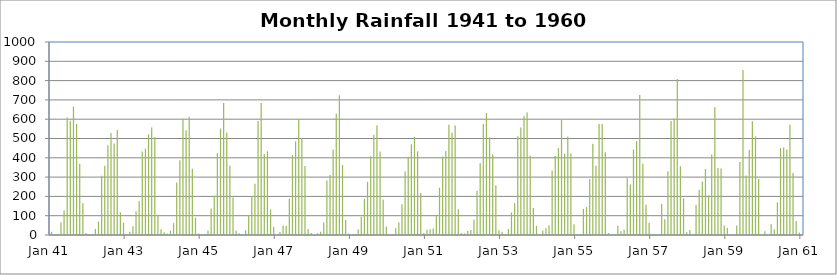
| Category | Monthly Rainfall |
|---|---|
| 1921-01-31 | 5.6 |
| 1921-02-28 | 4.6 |
| 1921-03-31 | 69.1 |
| 1921-04-30 | 92.2 |
| 1921-05-31 | 277.6 |
| 1921-06-30 | 375.2 |
| 1921-07-31 | 478.5 |
| 1921-08-31 | 572 |
| 1921-09-30 | 525.5 |
| 1921-10-31 | 407.7 |
| 1921-11-30 | 175.3 |
| 1921-12-31 | 46.2 |
| 1922-01-31 | 5.6 |
| 1922-02-28 | 4.6 |
| 1922-03-31 | 32 |
| 1922-04-30 | 75.9 |
| 1922-05-31 | 267 |
| 1922-06-30 | 479.8 |
| 1922-07-31 | 480.6 |
| 1922-08-31 | 583.7 |
| 1922-09-30 | 572.8 |
| 1922-10-31 | 399.8 |
| 1922-11-30 | 188.7 |
| 1922-12-31 | 37.6 |
| 1923-01-31 | 5.6 |
| 1923-02-28 | 4.6 |
| 1923-03-31 | 43.9 |
| 1923-04-30 | 93.7 |
| 1923-05-31 | 205.7 |
| 1923-06-30 | 435.1 |
| 1923-07-31 | 482.1 |
| 1923-08-31 | 575.8 |
| 1923-09-30 | 572.8 |
| 1923-10-31 | 411.7 |
| 1923-11-30 | 298.7 |
| 1923-12-31 | 33 |
| 1924-01-31 | 6.3 |
| 1924-02-29 | 49.5 |
| 1924-03-31 | 17.3 |
| 1924-04-30 | 62.2 |
| 1924-05-31 | 235.2 |
| 1924-06-30 | 422.9 |
| 1924-07-31 | 479 |
| 1924-08-31 | 588.3 |
| 1924-09-30 | 565.7 |
| 1924-10-31 | 405.1 |
| 1924-11-30 | 227.6 |
| 1924-12-31 | 18.8 |
| 1925-01-31 | 5.6 |
| 1925-02-28 | 16.8 |
| 1925-03-31 | 53.1 |
| 1925-04-30 | 53.3 |
| 1925-05-31 | 232.9 |
| 1925-06-30 | 435.9 |
| 1925-07-31 | 475.5 |
| 1925-08-31 | 572.8 |
| 1925-09-30 | 548.1 |
| 1925-10-31 | 435.9 |
| 1925-11-30 | 202.9 |
| 1925-12-31 | 28.7 |
| 1926-01-31 | 6.1 |
| 1926-02-28 | 4.6 |
| 1926-03-31 | 25.9 |
| 1926-04-30 | 55.9 |
| 1926-05-31 | 211.3 |
| 1926-06-30 | 398 |
| 1926-07-31 | 481.1 |
| 1926-08-31 | 598.9 |
| 1926-09-30 | 577.3 |
| 1926-10-31 | 400.6 |
| 1926-11-30 | 202.9 |
| 1926-12-31 | 22.4 |
| 1927-01-31 | 5.6 |
| 1927-02-28 | 6.3 |
| 1927-03-31 | 21.8 |
| 1927-04-30 | 89.7 |
| 1927-05-31 | 245.4 |
| 1927-06-30 | 426.5 |
| 1927-07-31 | 472.2 |
| 1927-08-31 | 559.6 |
| 1927-09-30 | 589.8 |
| 1927-10-31 | 445.3 |
| 1927-11-30 | 115.6 |
| 1927-12-31 | 22.4 |
| 1928-01-31 | 6.6 |
| 1928-02-29 | 4.6 |
| 1928-03-31 | 35.6 |
| 1928-04-30 | 145.5 |
| 1928-05-31 | 214.6 |
| 1928-06-30 | 379.7 |
| 1928-07-31 | 492.8 |
| 1928-08-31 | 586.2 |
| 1928-09-30 | 557.3 |
| 1928-10-31 | 448.6 |
| 1928-11-30 | 135.4 |
| 1928-12-31 | 24.9 |
| 1929-01-31 | 5.6 |
| 1929-02-28 | 4.6 |
| 1929-03-31 | 58.4 |
| 1929-04-30 | 87.9 |
| 1929-05-31 | 214.4 |
| 1929-06-30 | 411.2 |
| 1929-07-31 | 472.9 |
| 1929-08-31 | 584.2 |
| 1929-09-30 | 550.2 |
| 1929-10-31 | 410.5 |
| 1929-11-30 | 103.4 |
| 1929-12-31 | 18.8 |
| 1930-01-31 | 8.6 |
| 1930-02-28 | 42.4 |
| 1930-03-31 | 21.1 |
| 1930-04-30 | 57.1 |
| 1930-05-31 | 218.2 |
| 1930-06-30 | 397.5 |
| 1930-07-31 | 484.4 |
| 1930-08-31 | 578.1 |
| 1930-09-30 | 562.6 |
| 1930-10-31 | 404.6 |
| 1930-11-30 | 124 |
| 1930-12-31 | 24.9 |
| 1931-01-31 | 9.4 |
| 1931-02-28 | 4.6 |
| 1931-03-31 | 38.1 |
| 1931-04-30 | 119.6 |
| 1931-05-31 | 219.5 |
| 1931-06-30 | 440.7 |
| 1931-07-31 | 484.1 |
| 1931-08-31 | 573.5 |
| 1931-09-30 | 530.9 |
| 1931-10-31 | 404.9 |
| 1931-11-30 | 163.8 |
| 1931-12-31 | 22.6 |
| 1932-01-31 | 5.6 |
| 1932-02-29 | 22.9 |
| 1932-03-31 | 62.7 |
| 1932-04-30 | 122.4 |
| 1932-05-31 | 213.4 |
| 1932-06-30 | 438.4 |
| 1932-07-31 | 484.1 |
| 1932-08-31 | 597.4 |
| 1932-09-30 | 534.4 |
| 1932-10-31 | 417.1 |
| 1932-11-30 | 272.5 |
| 1932-12-31 | 18.8 |
| 1933-01-31 | 5.6 |
| 1933-02-28 | 58.9 |
| 1933-03-31 | 23.4 |
| 1933-04-30 | 81 |
| 1933-05-31 | 223.5 |
| 1933-06-30 | 424.9 |
| 1933-07-31 | 484.1 |
| 1933-08-31 | 632.5 |
| 1933-09-30 | 534.4 |
| 1933-10-31 | 383.5 |
| 1933-11-30 | 181.1 |
| 1933-12-31 | 31 |
| 1934-01-31 | 0.3 |
| 1934-02-28 | 2.5 |
| 1934-03-31 | 33.5 |
| 1934-04-30 | 58.4 |
| 1934-05-31 | 142.5 |
| 1934-06-30 | 333.5 |
| 1934-07-31 | 526.3 |
| 1934-08-31 | 569 |
| 1934-09-30 | 561.8 |
| 1934-10-31 | 464.8 |
| 1934-11-30 | 80.8 |
| 1934-12-31 | 7.6 |
| 1935-01-31 | 0.3 |
| 1935-02-28 | 7.1 |
| 1935-03-31 | 9.9 |
| 1935-04-30 | 34 |
| 1935-05-31 | 147.6 |
| 1935-06-30 | 285.5 |
| 1935-07-31 | 475.7 |
| 1935-08-31 | 539.5 |
| 1935-09-30 | 500.6 |
| 1935-10-31 | 320.8 |
| 1935-11-30 | 233.4 |
| 1935-12-31 | 49.8 |
| 1936-01-31 | 0.3 |
| 1936-02-29 | 10.7 |
| 1936-03-31 | 35.6 |
| 1936-04-30 | 73.7 |
| 1936-05-31 | 294.1 |
| 1936-06-30 | 263.1 |
| 1936-07-31 | 579.4 |
| 1936-08-31 | 494 |
| 1936-09-30 | 516.9 |
| 1936-10-31 | 395.5 |
| 1936-11-30 | 152.4 |
| 1936-12-31 | 27.2 |
| 1937-01-31 | 0.3 |
| 1937-02-28 | 3.3 |
| 1937-03-31 | 84.6 |
| 1937-04-30 | 54.9 |
| 1937-05-31 | 234.4 |
| 1937-06-30 | 355.1 |
| 1937-07-31 | 427.2 |
| 1937-08-31 | 665.7 |
| 1937-09-30 | 578.4 |
| 1937-10-31 | 463 |
| 1937-11-30 | 136.9 |
| 1937-12-31 | 11.9 |
| 1938-01-31 | 0.3 |
| 1938-02-28 | 8.9 |
| 1938-03-31 | 32 |
| 1938-04-30 | 64 |
| 1938-05-31 | 354.1 |
| 1938-06-30 | 480.1 |
| 1938-07-31 | 390.9 |
| 1938-08-31 | 627.4 |
| 1938-09-30 | 611.6 |
| 1938-10-31 | 409.2 |
| 1938-11-30 | 246.4 |
| 1938-12-31 | 7.6 |
| 1939-01-31 | 0.3 |
| 1939-02-28 | 2.8 |
| 1939-03-31 | 5.8 |
| 1939-04-30 | 44.4 |
| 1939-05-31 | 305.3 |
| 1939-06-30 | 594.9 |
| 1939-07-31 | 396.2 |
| 1939-08-31 | 557.8 |
| 1939-09-30 | 491.7 |
| 1939-10-31 | 310.1 |
| 1939-11-30 | 143 |
| 1939-12-31 | 21.8 |
| 1940-01-31 | 0.3 |
| 1940-02-29 | 2.5 |
| 1940-03-31 | 21.1 |
| 1940-04-30 | 26.9 |
| 1940-05-31 | 207 |
| 1940-06-30 | 390.4 |
| 1940-07-31 | 476 |
| 1940-08-31 | 549.1 |
| 1940-09-30 | 478.8 |
| 1940-10-31 | 433.6 |
| 1940-11-30 | 207.8 |
| 1940-12-31 | 33.5 |
| 1941-01-31 | 16.5 |
| 1941-02-28 | 2.5 |
| 1941-03-31 | 5.8 |
| 1941-04-30 | 65.5 |
| 1941-05-31 | 126.5 |
| 1941-06-30 | 608.8 |
| 1941-07-31 | 592.3 |
| 1941-08-31 | 665.2 |
| 1941-09-30 | 575.1 |
| 1941-10-31 | 369.8 |
| 1941-11-30 | 164.3 |
| 1941-12-31 | 10.7 |
| 1942-01-31 | 0.3 |
| 1942-02-28 | 2.5 |
| 1942-03-31 | 30.7 |
| 1942-04-30 | 69.8 |
| 1942-05-31 | 307.1 |
| 1942-06-30 | 358.9 |
| 1942-07-31 | 464.6 |
| 1942-08-31 | 529.1 |
| 1942-09-30 | 473.5 |
| 1942-10-31 | 543.6 |
| 1942-11-30 | 117.6 |
| 1942-12-31 | 64.3 |
| 1943-01-31 | 2.3 |
| 1943-02-28 | 16.8 |
| 1943-03-31 | 45 |
| 1943-04-30 | 123.4 |
| 1943-05-31 | 174.8 |
| 1943-06-30 | 432.1 |
| 1943-07-31 | 447.3 |
| 1943-08-31 | 521.5 |
| 1943-09-30 | 557.3 |
| 1943-10-31 | 506 |
| 1943-11-30 | 105.2 |
| 1943-12-31 | 29.7 |
| 1944-01-31 | 14 |
| 1944-02-29 | 7.9 |
| 1944-03-31 | 22.4 |
| 1944-04-30 | 61 |
| 1944-05-31 | 272.5 |
| 1944-06-30 | 387.9 |
| 1944-07-31 | 602.7 |
| 1944-08-31 | 542.3 |
| 1944-09-30 | 612.1 |
| 1944-10-31 | 343.4 |
| 1944-11-30 | 89.2 |
| 1944-12-31 | 7.9 |
| 1945-01-31 | 0.5 |
| 1945-02-28 | 5.3 |
| 1945-03-31 | 23.6 |
| 1945-04-30 | 136.9 |
| 1945-05-31 | 203.7 |
| 1945-06-30 | 424.9 |
| 1945-07-31 | 551.2 |
| 1945-08-31 | 684.5 |
| 1945-09-30 | 531.1 |
| 1945-10-31 | 358.4 |
| 1945-11-30 | 194.3 |
| 1945-12-31 | 21.8 |
| 1946-01-31 | 9.4 |
| 1946-02-28 | 2.5 |
| 1946-03-31 | 24.9 |
| 1946-04-30 | 101.3 |
| 1946-05-31 | 202.2 |
| 1946-06-30 | 265.4 |
| 1946-07-31 | 591.1 |
| 1946-08-31 | 683.5 |
| 1946-09-30 | 419.6 |
| 1946-10-31 | 433.6 |
| 1946-11-30 | 132.3 |
| 1946-12-31 | 42.7 |
| 1947-01-31 | 0.3 |
| 1947-02-28 | 16 |
| 1947-03-31 | 48.8 |
| 1947-04-30 | 47.2 |
| 1947-05-31 | 187.5 |
| 1947-06-30 | 414.5 |
| 1947-07-31 | 485.6 |
| 1947-08-31 | 598.4 |
| 1947-09-30 | 503.2 |
| 1947-10-31 | 357.9 |
| 1947-11-30 | 30.7 |
| 1947-12-31 | 10.9 |
| 1948-01-31 | 0.3 |
| 1948-02-29 | 9.1 |
| 1948-03-31 | 17.3 |
| 1948-04-30 | 65 |
| 1948-05-31 | 282.4 |
| 1948-06-30 | 310.9 |
| 1948-07-31 | 443.5 |
| 1948-08-31 | 627.9 |
| 1948-09-30 | 724.2 |
| 1948-10-31 | 362.5 |
| 1948-11-30 | 78 |
| 1948-12-31 | 8.4 |
| 1949-01-31 | 0.3 |
| 1949-02-28 | 2.5 |
| 1949-03-31 | 28.2 |
| 1949-04-30 | 94 |
| 1949-05-31 | 187.5 |
| 1949-06-30 | 275.3 |
| 1949-07-31 | 407.7 |
| 1949-08-31 | 519.2 |
| 1949-09-30 | 569.2 |
| 1949-10-31 | 432.1 |
| 1949-11-30 | 182.4 |
| 1949-12-31 | 44.2 |
| 1950-01-31 | 0.3 |
| 1950-02-28 | 2.5 |
| 1950-03-31 | 35.3 |
| 1950-04-30 | 64.3 |
| 1950-05-31 | 159.3 |
| 1950-06-30 | 329.4 |
| 1950-07-31 | 404.4 |
| 1950-08-31 | 469.6 |
| 1950-09-30 | 509 |
| 1950-10-31 | 433.6 |
| 1950-11-30 | 217.2 |
| 1950-12-31 | 9.9 |
| 1951-01-31 | 27.7 |
| 1951-02-28 | 30.2 |
| 1951-03-31 | 34 |
| 1951-04-30 | 98 |
| 1951-05-31 | 245.1 |
| 1951-06-30 | 407.2 |
| 1951-07-31 | 434.8 |
| 1951-08-31 | 571 |
| 1951-09-30 | 530.1 |
| 1951-10-31 | 567.2 |
| 1951-11-30 | 133.9 |
| 1951-12-31 | 9.4 |
| 1952-01-31 | 8.1 |
| 1952-02-29 | 20.3 |
| 1952-03-31 | 25.7 |
| 1952-04-30 | 78.5 |
| 1952-05-31 | 229.6 |
| 1952-06-30 | 372.4 |
| 1952-07-31 | 574.5 |
| 1952-08-31 | 631.7 |
| 1952-09-30 | 505.5 |
| 1952-10-31 | 418.6 |
| 1952-11-30 | 258.1 |
| 1952-12-31 | 24.4 |
| 1953-01-31 | 17.3 |
| 1953-02-28 | 5.1 |
| 1953-03-31 | 31.7 |
| 1953-04-30 | 116.8 |
| 1953-05-31 | 165.4 |
| 1953-06-30 | 512.1 |
| 1953-07-31 | 556.5 |
| 1953-08-31 | 616.5 |
| 1953-09-30 | 634.2 |
| 1953-10-31 | 410.7 |
| 1953-11-30 | 139.7 |
| 1953-12-31 | 47 |
| 1954-01-31 | 0.3 |
| 1954-02-28 | 23.9 |
| 1954-03-31 | 34.5 |
| 1954-04-30 | 50.8 |
| 1954-05-31 | 333.8 |
| 1954-06-30 | 408.7 |
| 1954-07-31 | 450.3 |
| 1954-08-31 | 595.9 |
| 1954-09-30 | 421.1 |
| 1954-10-31 | 509.8 |
| 1954-11-30 | 421.6 |
| 1954-12-31 | 55.4 |
| 1955-01-31 | 0.3 |
| 1955-02-28 | 4.1 |
| 1955-03-31 | 135.4 |
| 1955-04-30 | 144.5 |
| 1955-05-31 | 289.8 |
| 1955-06-30 | 472.9 |
| 1955-07-31 | 358.6 |
| 1955-08-31 | 574.8 |
| 1955-09-30 | 575.1 |
| 1955-10-31 | 428.5 |
| 1955-11-30 | 10.4 |
| 1955-12-31 | 0 |
| 1956-01-31 | 0 |
| 1956-02-29 | 48.5 |
| 1956-03-31 | 18.8 |
| 1956-04-30 | 26.9 |
| 1956-05-31 | 294.4 |
| 1956-06-30 | 261.6 |
| 1956-07-31 | 443 |
| 1956-08-31 | 485.9 |
| 1956-09-30 | 725.7 |
| 1956-10-31 | 369.8 |
| 1956-11-30 | 156.5 |
| 1956-12-31 | 63.5 |
| 1957-01-31 | 0 |
| 1957-02-28 | 0 |
| 1957-03-31 | 0 |
| 1957-04-30 | 160.8 |
| 1957-05-31 | 81 |
| 1957-06-30 | 329.9 |
| 1957-07-31 | 591 |
| 1957-08-31 | 604 |
| 1957-09-30 | 808 |
| 1957-10-31 | 356.1 |
| 1957-11-30 | 190 |
| 1957-12-31 | 14.5 |
| 1958-01-31 | 25.4 |
| 1958-02-28 | 5.6 |
| 1958-03-31 | 156 |
| 1958-04-30 | 234.7 |
| 1958-05-31 | 276.9 |
| 1958-06-30 | 342.1 |
| 1958-07-31 | 206 |
| 1958-08-31 | 417.3 |
| 1958-09-30 | 661.7 |
| 1958-10-31 | 346.7 |
| 1958-11-30 | 344.2 |
| 1958-12-31 | 49 |
| 1959-01-31 | 36.1 |
| 1959-02-28 | 0 |
| 1959-03-31 | 0 |
| 1959-04-30 | 48.8 |
| 1959-05-31 | 377.7 |
| 1959-06-30 | 855.5 |
| 1959-07-31 | 308.9 |
| 1959-08-31 | 440.2 |
| 1959-09-30 | 590 |
| 1959-10-31 | 510.8 |
| 1959-11-30 | 289.6 |
| 1959-12-31 | 0 |
| 1960-01-31 | 19.8 |
| 1960-02-29 | 0.5 |
| 1960-03-31 | 55.4 |
| 1960-04-30 | 30 |
| 1960-05-31 | 168.7 |
| 1960-06-30 | 450.8 |
| 1960-07-31 | 453.9 |
| 1960-08-31 | 442.5 |
| 1960-09-30 | 573 |
| 1960-10-31 | 321.8 |
| 1960-11-30 | 71.9 |
| 1960-12-31 | 13.2 |
| 1961-01-31 | 0 |
| 1961-02-28 | 10.7 |
| 1961-03-31 | 0 |
| 1961-04-30 | 77.2 |
| 1961-05-31 | 235.2 |
| 1961-06-30 | 301.5 |
| 1961-07-31 | 820.9 |
| 1961-08-31 | 404.6 |
| 1961-09-30 | 357.1 |
| 1961-10-31 | 275.3 |
| 1961-11-30 | 85.3 |
| 1961-12-31 | 0 |
| 1962-01-31 | 0 |
| 1962-02-28 | 0 |
| 1962-03-31 | 4.3 |
| 1962-04-30 | 194.8 |
| 1962-05-31 | 279.4 |
| 1962-06-30 | 365.5 |
| 1962-07-31 | 627.4 |
| 1962-08-31 | 657.6 |
| 1962-09-30 | 517.1 |
| 1962-10-31 | 365.3 |
| 1962-11-30 | 282.7 |
| 1962-12-31 | 12.2 |
| 1963-01-31 | 8.9 |
| 1963-02-28 | 33.8 |
| 1963-03-31 | 38.4 |
| 1963-04-30 | 70.4 |
| 1963-05-31 | 156.5 |
| 1963-06-30 | 404.6 |
| 1963-07-31 | 373.6 |
| 1963-08-31 | 696.7 |
| 1963-09-30 | 405.1 |
| 1963-10-31 | 465.8 |
| 1963-11-30 | 94.7 |
| 1963-12-31 | 0 |
| 1964-01-31 | 0 |
| 1964-02-29 | 0 |
| 1964-03-31 | 29.5 |
| 1964-04-30 | 14.7 |
| 1964-05-31 | 165.6 |
| 1964-06-30 | 356.6 |
| 1964-07-31 | 617.7 |
| 1964-08-31 | 721.1 |
| 1964-09-30 | 730.5 |
| 1964-10-31 | 397.3 |
| 1964-11-30 | 152.1 |
| 1964-12-31 | 56.9 |
| 1965-01-31 | 71.9 |
| 1965-02-28 | 4.8 |
| 1965-03-31 | 10.2 |
| 1965-04-30 | 48 |
| 1965-05-31 | 167.4 |
| 1965-06-30 | 428.5 |
| 1965-07-31 | 508 |
| 1965-08-31 | 706.9 |
| 1965-09-30 | 499.4 |
| 1965-10-31 | 372.1 |
| 1965-11-30 | 194.1 |
| 1965-12-31 | 0 |
| 1966-01-31 | 0 |
| 1966-02-28 | 39.4 |
| 1966-03-31 | 29.7 |
| 1966-04-30 | 56.6 |
| 1966-05-31 | 182.4 |
| 1966-06-30 | 374.1 |
| 1966-07-31 | 341.4 |
| 1966-08-31 | 753.6 |
| 1966-09-30 | 610.1 |
| 1966-10-31 | 347.7 |
| 1966-11-30 | 169.2 |
| 1966-12-31 | 30.2 |
| 1967-01-31 | 0 |
| 1967-02-28 | 0 |
| 1967-03-31 | 31.2 |
| 1967-04-30 | 44.2 |
| 1967-05-31 | 251.2 |
| 1967-06-30 | 360.4 |
| 1967-07-31 | 644.9 |
| 1967-08-31 | 698 |
| 1967-09-30 | 508 |
| 1967-10-31 | 435.1 |
| 1967-11-30 | 211.1 |
| 1967-12-31 | 3.3 |
| 1968-01-31 | 0 |
| 1968-02-29 | 22.4 |
| 1968-03-31 | 25.4 |
| 1968-04-30 | 81.5 |
| 1968-05-31 | 283 |
| 1968-06-30 | 625.6 |
| 1968-07-31 | 397.5 |
| 1968-08-31 | 683 |
| 1968-09-30 | 863.6 |
| 1968-10-31 | 391.4 |
| 1968-11-30 | 156.7 |
| 1968-12-31 | 31.7 |
| 1969-01-31 | 1.3 |
| 1969-02-28 | 19 |
| 1969-03-31 | 59.2 |
| 1969-04-30 | 106.7 |
| 1969-05-31 | 180.1 |
| 1969-06-30 | 339.1 |
| 1969-07-31 | 542.3 |
| 1969-08-31 | 640.1 |
| 1969-09-30 | 649.7 |
| 1969-10-31 | 396.7 |
| 1969-11-30 | 173 |
| 1969-12-31 | 48 |
| 1970-01-31 | 0 |
| 1970-02-28 | 2.5 |
| 1970-03-31 | 40.4 |
| 1970-04-30 | 62.2 |
| 1970-05-31 | 265.2 |
| 1970-06-30 | 301.8 |
| 1970-07-31 | 782.3 |
| 1970-08-31 | 600.5 |
| 1970-09-30 | 500.1 |
| 1970-10-31 | 269.7 |
| 1970-11-30 | 199.1 |
| 1970-12-31 | 38.4 |
| 1971-01-31 | 0 |
| 1971-02-28 | 11.4 |
| 1971-03-31 | 3.6 |
| 1971-04-30 | 226.3 |
| 1971-05-31 | 170.9 |
| 1971-06-30 | 306.3 |
| 1971-07-31 | 229.9 |
| 1971-08-31 | 831.6 |
| 1971-09-30 | 568.7 |
| 1971-10-31 | 338.6 |
| 1971-11-30 | 222 |
| 1971-12-31 | 61 |
| 1972-01-31 | 0 |
| 1972-02-29 | 0 |
| 1972-03-31 | 46.2 |
| 1972-04-30 | 97.3 |
| 1972-05-31 | 223.3 |
| 1972-06-30 | 596.6 |
| 1972-07-31 | 544.6 |
| 1972-08-31 | 744.7 |
| 1972-09-30 | 360.7 |
| 1972-10-31 | 478.8 |
| 1972-11-30 | 4.1 |
| 1972-12-31 | 0 |
| 1973-01-31 | 0 |
| 1973-02-28 | 0 |
| 1973-03-31 | 6.3 |
| 1973-04-30 | 52.6 |
| 1973-05-31 | 288.8 |
| 1973-06-30 | 342.9 |
| 1973-07-31 | 370.1 |
| 1973-08-31 | 635.3 |
| 1973-09-30 | 436.9 |
| 1973-10-31 | 517.7 |
| 1973-11-30 | 193.5 |
| 1973-12-31 | 3.6 |
| 1974-01-31 | 0 |
| 1974-02-28 | 0 |
| 1974-03-31 | 27.9 |
| 1974-04-30 | 81 |
| 1974-05-31 | 125.2 |
| 1974-06-30 | 336.8 |
| 1974-07-31 | 510.8 |
| 1974-08-31 | 426 |
| 1974-09-30 | 454.9 |
| 1974-10-31 | 474.7 |
| 1974-11-30 | 162.8 |
| 1974-12-31 | 0 |
| 1975-01-31 | 0 |
| 1975-02-28 | 0 |
| 1975-03-31 | 0 |
| 1975-04-30 | 116.8 |
| 1975-05-31 | 258.6 |
| 1975-06-30 | 342.6 |
| 1975-07-31 | 574 |
| 1975-08-31 | 656.1 |
| 1975-09-30 | 429 |
| 1975-10-31 | 448.8 |
| 1975-11-30 | 56.9 |
| 1975-12-31 | 33.5 |
| 1976-01-31 | 0 |
| 1976-02-29 | 10.4 |
| 1976-03-31 | 2.8 |
| 1976-04-30 | 139.2 |
| 1976-05-31 | 146.8 |
| 1976-06-30 | 598.4 |
| 1976-07-31 | 386.8 |
| 1976-08-31 | 314.2 |
| 1976-09-30 | 585.5 |
| 1976-10-31 | 532.4 |
| 1976-11-30 | 207.5 |
| 1976-12-31 | 27.4 |
| 1977-01-31 | 0 |
| 1977-02-28 | 0 |
| 1977-03-31 | 4.3 |
| 1977-04-30 | 48 |
| 1977-05-31 | 207.3 |
| 1977-06-30 | 496.3 |
| 1977-07-31 | 531.6 |
| 1977-08-31 | 479 |
| 1977-09-30 | 745.2 |
| 1977-10-31 | 425.2 |
| 1977-11-30 | 36.8 |
| 1977-12-31 | 2.5 |
| 1978-01-31 | 9.4 |
| 1978-02-28 | 58.4 |
| 1978-03-31 | 11.2 |
| 1978-04-30 | 155.4 |
| 1978-05-31 | 279.4 |
| 1978-06-30 | 377.2 |
| 1978-07-31 | 474.7 |
| 1978-08-31 | 596.9 |
| 1978-09-30 | 591.8 |
| 1978-10-31 | 442.2 |
| 1978-11-30 | 170.2 |